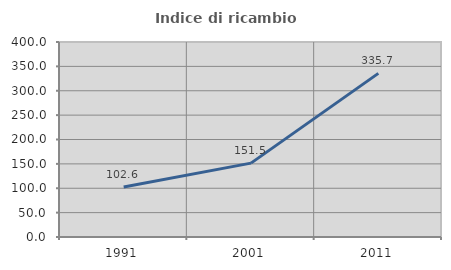
| Category | Indice di ricambio occupazionale  |
|---|---|
| 1991.0 | 102.572 |
| 2001.0 | 151.536 |
| 2011.0 | 335.676 |